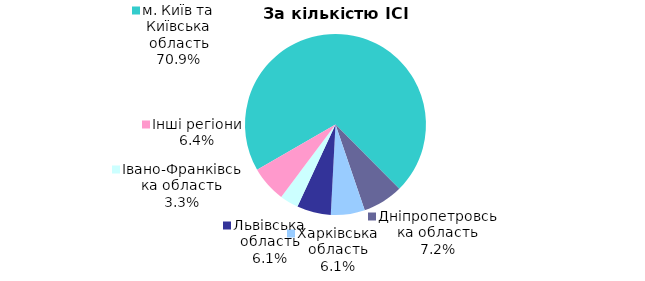
| Category | Series 0 |
|---|---|
| м. Київ та Київська область | 0.709 |
| Дніпропетровська область | 0.072 |
| Харківська область | 0.061 |
| Львівська область | 0.061 |
| Iвано-Франкiвська область | 0.033 |
| Інші регіони | 0.064 |